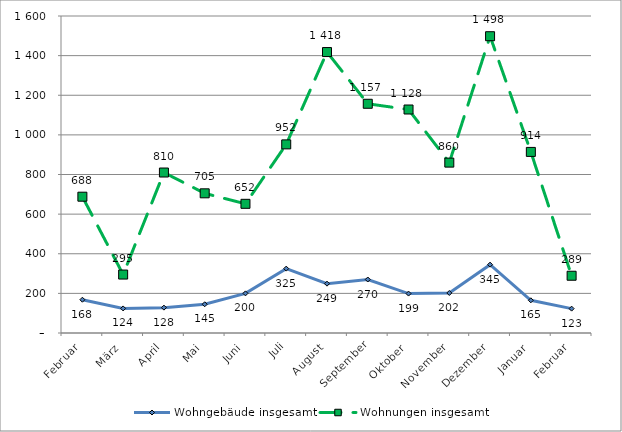
| Category | Wohngebäude insgesamt | Wohnungen insgesamt |
|---|---|---|
| Februar | 168 | 688 |
| März | 124 | 295 |
| April | 128 | 810 |
| Mai | 145 | 705 |
| Juni | 200 | 652 |
| Juli | 325 | 952 |
| August | 249 | 1418 |
| September | 270 | 1157 |
| Oktober | 199 | 1128 |
| November | 202 | 860 |
| Dezember | 345 | 1498 |
| Januar | 165 | 914 |
| Februar | 123 | 289 |